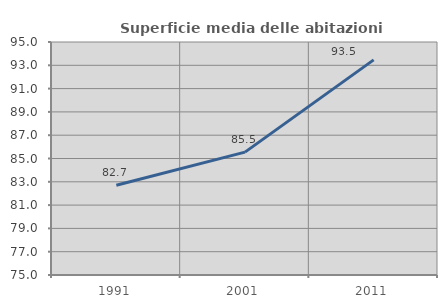
| Category | Superficie media delle abitazioni occupate |
|---|---|
| 1991.0 | 82.709 |
| 2001.0 | 85.549 |
| 2011.0 | 93.463 |